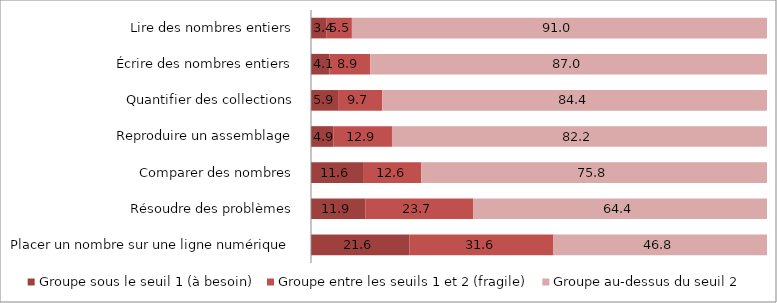
| Category | Groupe sous le seuil 1 (à besoin) | Groupe entre les seuils 1 et 2 (fragile) | Groupe au-dessus du seuil 2 |
|---|---|---|---|
| Placer un nombre sur une ligne numérique | 21.62 | 31.55 | 46.83 |
| Résoudre des problèmes | 11.9 | 23.71 | 64.39 |
| Comparer des nombres | 11.59 | 12.61 | 75.81 |
| Reproduire un assemblage | 4.87 | 12.89 | 82.24 |
| Quantifier des collections | 5.94 | 9.68 | 84.38 |
| Écrire des nombres entiers | 4.06 | 8.91 | 87.03 |
| Lire des nombres entiers | 3.44 | 5.53 | 91.03 |